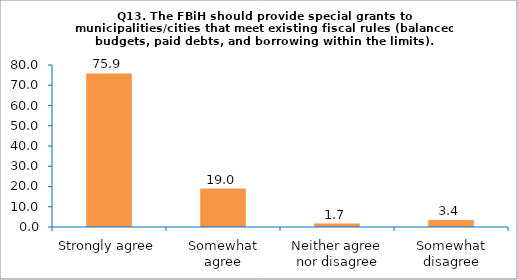
| Category | Series 0 |
|---|---|
| Strongly agree | 75.862 |
| Somewhat agree | 18.966 |
| Neither agree nor disagree | 1.724 |
| Somewhat disagree | 3.448 |